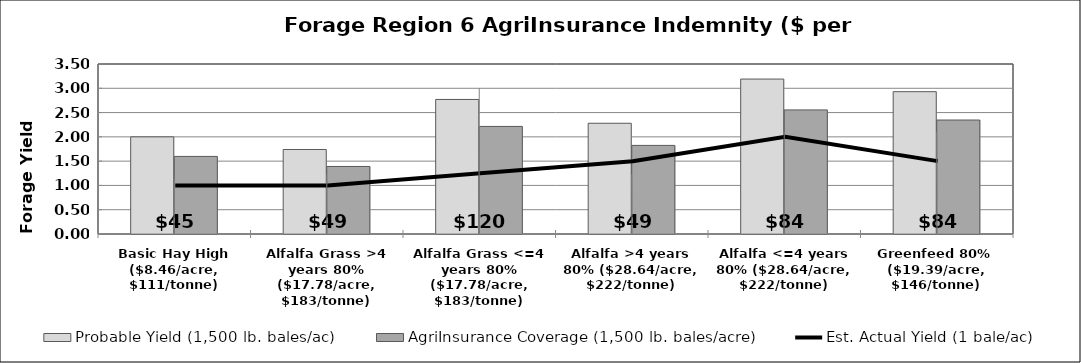
| Category | Probable Yield (1,500 lb. bales/ac) | AgriInsurance Coverage (1,500 lb. bales/acre) |
|---|---|---|
| Basic Hay High ($8.46/acre, $111/tonne) | 2 | 1.597 |
| Alfalfa Grass >4 years 80% ($17.78/acre, $183/tonne) | 1.74 | 1.391 |
| Alfalfa Grass <=4 years 80% ($17.78/acre, $183/tonne) | 2.77 | 2.215 |
| Alfalfa >4 years 80% ($28.64/acre, $222/tonne) | 2.28 | 1.824 |
| Alfalfa <=4 years 80% ($28.64/acre, $222/tonne) | 3.19 | 2.555 |
| Greenfeed 80%  ($19.39/acre, $146/tonne) | 2.93 | 2.347 |